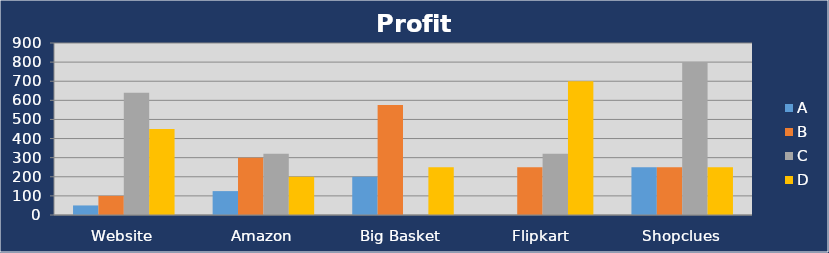
| Category | A | B | C | D |
|---|---|---|---|---|
| Website | 50 | 100 | 640 | 450 |
| Amazon | 125 | 300 | 320 | 200 |
| Big Basket | 200 | 575 | 0 | 250 |
| Flipkart | 0 | 250 | 320 | 700 |
| Shopclues | 250 | 250 | 800 | 250 |